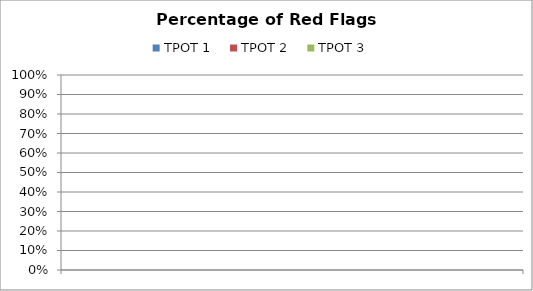
| Category | TPOT 1 | TPOT 2 | TPOT 3 |
|---|---|---|---|
|  | 0 | 0 | 0 |